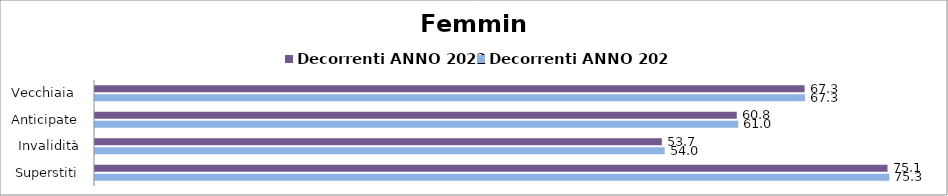
| Category | Decorrenti ANNO 2022 | Decorrenti ANNO 2023 |
|---|---|---|
| Vecchiaia  | 67.26 | 67.3 |
| Anticipate | 60.83 | 60.97 |
| Invalidità | 53.73 | 54 |
| Superstiti | 75.12 | 75.3 |